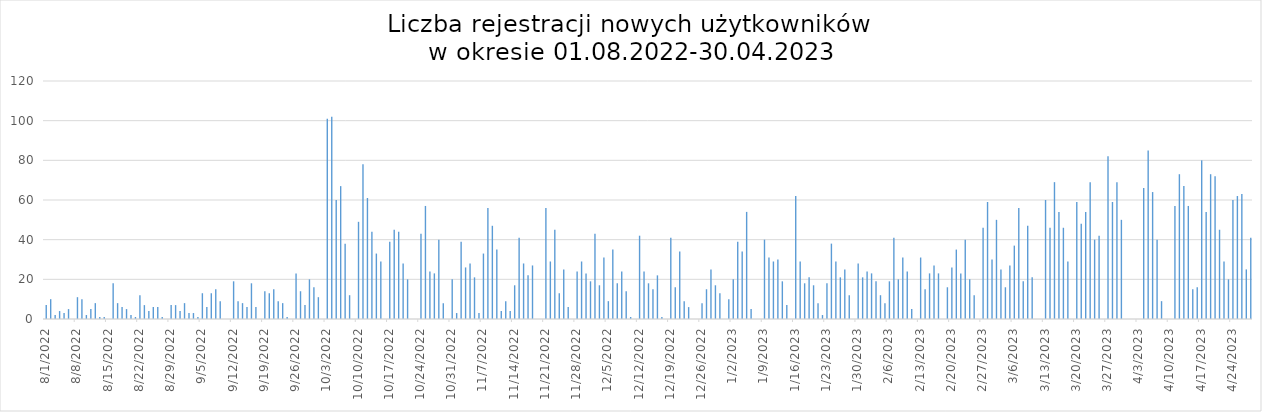
| Category | Dzienna liczba rejestracji |
|---|---|
| 8/1/22 | 7 |
| 8/2/22 | 10 |
| 8/3/22 | 2 |
| 8/4/22 | 4 |
| 8/5/22 | 3 |
| 8/6/22 | 5 |
| 8/8/22 | 11 |
| 8/9/22 | 10 |
| 8/10/22 | 2 |
| 8/11/22 | 5 |
| 8/12/22 | 8 |
| 8/13/22 | 1 |
| 8/14/22 | 1 |
| 8/16/22 | 18 |
| 8/17/22 | 8 |
| 8/18/22 | 6 |
| 8/19/22 | 5 |
| 8/20/22 | 2 |
| 8/21/22 | 1 |
| 8/22/22 | 12 |
| 8/23/22 | 7 |
| 8/24/22 | 4 |
| 8/25/22 | 6 |
| 8/26/22 | 6 |
| 8/27/22 | 1 |
| 8/29/22 | 7 |
| 8/30/22 | 7 |
| 8/31/22 | 4 |
| 9/1/22 | 8 |
| 9/2/22 | 3 |
| 9/3/22 | 3 |
| 9/4/22 | 1 |
| 9/5/22 | 13 |
| 9/6/22 | 6 |
| 9/7/22 | 13 |
| 9/8/22 | 15 |
| 9/9/22 | 9 |
| 9/12/22 | 19 |
| 9/13/22 | 9 |
| 9/14/22 | 8 |
| 9/15/22 | 6 |
| 9/16/22 | 18 |
| 9/17/22 | 6 |
| 9/19/22 | 14 |
| 9/20/22 | 13 |
| 9/21/22 | 15 |
| 9/22/22 | 9 |
| 9/23/22 | 8 |
| 9/24/22 | 1 |
| 9/26/22 | 23 |
| 9/27/22 | 14 |
| 9/28/22 | 7 |
| 9/29/22 | 20 |
| 9/30/22 | 16 |
| 10/1/22 | 11 |
| 10/3/22 | 101 |
| 10/4/22 | 102 |
| 10/5/22 | 60 |
| 10/6/22 | 67 |
| 10/7/22 | 38 |
| 10/8/22 | 12 |
| 10/10/22 | 49 |
| 10/11/22 | 78 |
| 10/12/22 | 61 |
| 10/13/22 | 44 |
| 10/14/22 | 33 |
| 10/15/22 | 29 |
| 10/17/22 | 39 |
| 10/18/22 | 45 |
| 10/19/22 | 44 |
| 10/20/22 | 28 |
| 10/21/22 | 20 |
| 10/24/22 | 43 |
| 10/25/22 | 57 |
| 10/26/22 | 24 |
| 10/27/22 | 23 |
| 10/28/22 | 40 |
| 10/29/22 | 8 |
| 10/31/22 | 20 |
| 11/1/22 | 3 |
| 11/2/22 | 39 |
| 11/3/22 | 26 |
| 11/4/22 | 28 |
| 11/5/22 | 21 |
| 11/6/22 | 3 |
| 11/7/22 | 33 |
| 11/8/22 | 56 |
| 11/9/22 | 47 |
| 11/10/22 | 35 |
| 11/11/22 | 4 |
| 11/12/22 | 9 |
| 11/13/22 | 4 |
| 11/14/22 | 17 |
| 11/15/22 | 41 |
| 11/16/22 | 28 |
| 11/17/22 | 22 |
| 11/18/22 | 27 |
| 11/21/22 | 56 |
| 11/22/22 | 29 |
| 11/23/22 | 45 |
| 11/24/22 | 13 |
| 11/25/22 | 25 |
| 11/26/22 | 6 |
| 11/28/22 | 24 |
| 11/29/22 | 29 |
| 11/30/22 | 23 |
| 12/1/22 | 19 |
| 12/2/22 | 43 |
| 12/3/22 | 17 |
| 12/4/22 | 31 |
| 12/5/22 | 9 |
| 12/6/22 | 35 |
| 12/7/22 | 18 |
| 12/8/22 | 24 |
| 12/9/22 | 14 |
| 12/10/22 | 1 |
| 12/12/22 | 42 |
| 12/13/22 | 24 |
| 12/14/22 | 18 |
| 12/15/22 | 15 |
| 12/16/22 | 22 |
| 12/17/22 | 1 |
| 12/19/22 | 41 |
| 12/20/22 | 16 |
| 12/21/22 | 34 |
| 12/22/22 | 9 |
| 12/23/22 | 6 |
| 12/26/22 | 8 |
| 12/27/22 | 15 |
| 12/28/22 | 25 |
| 12/29/22 | 17 |
| 12/30/22 | 13 |
| 1/1/23 | 10 |
| 1/2/23 | 20 |
| 1/3/23 | 39 |
| 1/4/23 | 34 |
| 1/5/23 | 54 |
| 1/6/23 | 5 |
| 1/9/23 | 40 |
| 1/10/23 | 31 |
| 1/11/23 | 29 |
| 1/12/23 | 30 |
| 1/13/23 | 19 |
| 1/14/23 | 7 |
| 1/16/23 | 62 |
| 1/17/23 | 29 |
| 1/18/23 | 18 |
| 1/19/23 | 21 |
| 1/20/23 | 17 |
| 1/21/23 | 8 |
| 1/22/23 | 2 |
| 1/23/23 | 18 |
| 1/24/23 | 38 |
| 1/25/23 | 29 |
| 1/26/23 | 21 |
| 1/27/23 | 25 |
| 1/28/23 | 12 |
| 1/30/23 | 28 |
| 1/31/23 | 21 |
| 2/1/23 | 24 |
| 2/2/23 | 23 |
| 2/3/23 | 19 |
| 2/4/23 | 12 |
| 2/5/23 | 8 |
| 2/6/23 | 19 |
| 2/7/23 | 41 |
| 2/8/23 | 20 |
| 2/9/23 | 31 |
| 2/10/23 | 24 |
| 2/11/23 | 5 |
| 2/13/23 | 31 |
| 2/14/23 | 15 |
| 2/15/23 | 23 |
| 2/16/23 | 27 |
| 2/17/23 | 23 |
| 2/19/23 | 16 |
| 2/20/23 | 26 |
| 2/21/23 | 35 |
| 2/22/23 | 23 |
| 2/23/23 | 40 |
| 2/24/23 | 20 |
| 2/25/23 | 12 |
| 2/27/23 | 46 |
| 2/28/23 | 59 |
| 3/1/23 | 30 |
| 3/2/23 | 50 |
| 3/3/23 | 25 |
| 3/4/23 | 16 |
| 3/5/23 | 27 |
| 3/6/23 | 37 |
| 3/7/23 | 56 |
| 3/8/23 | 19 |
| 3/9/23 | 47 |
| 3/10/23 | 21 |
| 3/13/23 | 60 |
| 3/14/23 | 46 |
| 3/15/23 | 69 |
| 3/16/23 | 54 |
| 3/17/23 | 46 |
| 3/18/23 | 29 |
| 3/20/23 | 59 |
| 3/21/23 | 48 |
| 3/22/23 | 54 |
| 3/23/23 | 69 |
| 3/24/23 | 40 |
| 3/25/23 | 42 |
| 3/27/23 | 82 |
| 3/28/23 | 59 |
| 3/29/23 | 69 |
| 3/30/23 | 50 |
| 4/4/23 | 66 |
| 4/5/23 | 85 |
| 4/6/23 | 64 |
| 4/7/23 | 40 |
| 4/8/23 | 9 |
| 4/11/23 | 57 |
| 4/12/23 | 73 |
| 4/13/23 | 67 |
| 4/14/23 | 57 |
| 4/15/23 | 15 |
| 4/16/23 | 16 |
| 4/17/23 | 80 |
| 4/18/23 | 54 |
| 4/19/23 | 73 |
| 4/20/23 | 72 |
| 4/21/23 | 45 |
| 4/22/23 | 29 |
| 4/23/23 | 20 |
| 4/24/23 | 60 |
| 4/25/23 | 62 |
| 4/26/23 | 63 |
| 4/27/23 | 25 |
| 4/28/23 | 41 |